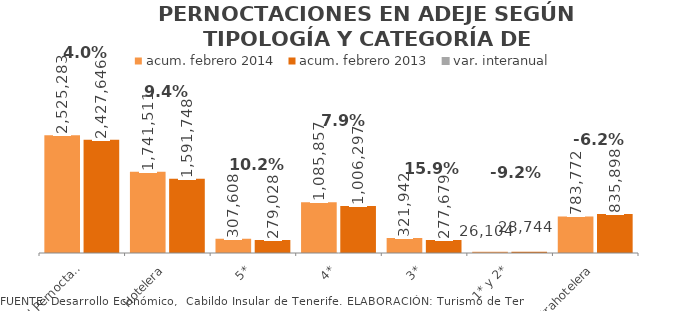
| Category | acum. febrero 2014 | acum. febrero 2013 |
|---|---|---|
| Total Pernoctaciones | 2525283 | 2427646 |
| Hotelera | 1741511 | 1591748 |
| 5* | 307608 | 279028 |
| 4* | 1085857 | 1006297 |
| 3* | 321942 | 277679 |
| 1* y 2* | 26104 | 28744 |
| Extrahotelera | 783772 | 835898 |